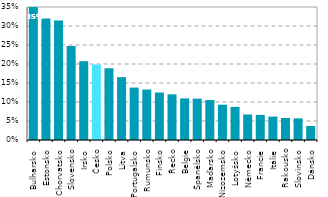
| Category | Series 0 |
|---|---|
| Bulharsko | 0.35 |
| Estonsko | 0.32 |
| Chorvatsko | 0.315 |
| Slovensko | 0.247 |
| Irsko | 0.207 |
| Česko | 0.199 |
| Polsko | 0.189 |
| Litva | 0.165 |
| Portugalsko | 0.138 |
| Rumunsko | 0.133 |
| Finsko | 0.125 |
| Řecko | 0.12 |
| Belgie | 0.109 |
| Španělsko | 0.109 |
| Maďarsko | 0.105 |
| Nizozemsko | 0.093 |
| Lotyšsko | 0.087 |
| Německo | 0.067 |
| Francie | 0.066 |
| Itálie | 0.062 |
| Rakousko | 0.058 |
| Slovinsko | 0.057 |
| Dánsko | 0.037 |